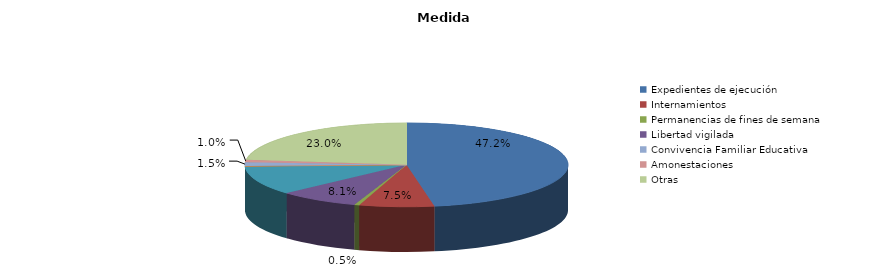
| Category | Series 0 |
|---|---|
| Expedientes de ejecución | 386 |
| Internamientos | 61 |
| Permanencias de fines de semana | 4 |
| Libertad vigilada | 66 |
| Prestaciones en beneficio de la comunidad | 91 |
| Privación de permisos y licencias | 1 |
| Convivencia Familiar Educativa | 12 |
| Amonestaciones | 8 |
| Otras | 188 |